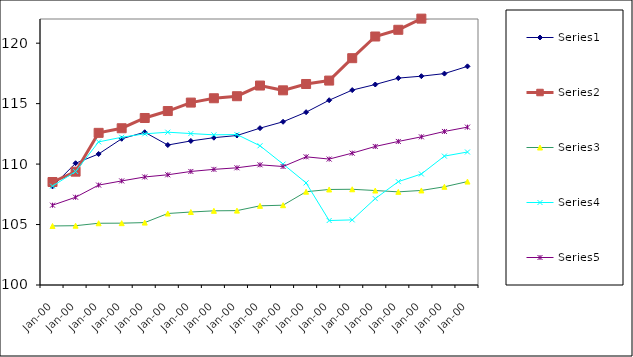
| Category | Series 0 | Series 1 | Series 2 | Series 3 | Series 4 |
|---|---|---|---|---|---|
| 0 | 108.156 | 108.519 | 104.883 | 108.18 | 106.601 |
| 1900-01-01 | 110.07 | 109.373 | 104.905 | 109.388 | 107.257 |
| 1900-01-02 | 110.836 | 112.583 | 105.106 | 111.837 | 108.264 |
| 1900-01-03 | 112.095 | 112.965 | 105.114 | 112.218 | 108.608 |
| 1900-01-04 | 112.634 | 113.813 | 105.162 | 112.502 | 108.936 |
| 1900-01-05 | 111.577 | 114.387 | 105.914 | 112.638 | 109.117 |
| 1900-01-06 | 111.915 | 115.087 | 106.036 | 112.525 | 109.391 |
| 1900-01-07 | 112.185 | 115.445 | 106.136 | 112.42 | 109.563 |
| 1900-01-08 | 112.363 | 115.614 | 106.151 | 112.444 | 109.694 |
| 1900-01-09 | 112.971 | 116.497 | 106.547 | 111.515 | 109.94 |
| 1900-01-10 | 113.5 | 116.1 | 106.6 | 110 | 109.8 |
| 1900-01-11 | 114.295 | 116.625 | 107.716 | 108.446 | 110.601 |
| 1900-01-12 | 115.283 | 116.906 | 107.901 | 105.333 | 110.415 |
| 1900-01-13 | 116.12 | 118.76 | 107.917 | 105.386 | 110.906 |
| 1900-01-14 | 116.582 | 120.552 | 107.812 | 107.146 | 111.458 |
| 1900-01-15 | 117.112 | 121.107 | 107.704 | 108.548 | 111.873 |
| 1900-01-16 | 117.271 | 122.03 | 107.821 | 109.182 | 112.254 |
| 1900-01-17 | 117.484 | 122.282 | 108.124 | 110.66 | 112.699 |
| 1900-01-18 | 118.084 | 123.363 | 108.552 | 111 | 113.056 |